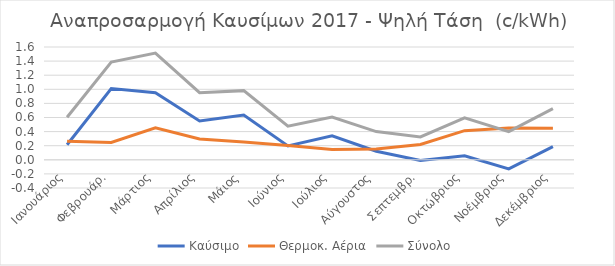
| Category | Καύσιμο | Θερμοκ. Αέρια | Σύνολο |
|---|---|---|---|
| Ιανουάριος | 0.214 | 0.262 | 0.604 |
| Φεβρουάρ. | 1.011 | 0.246 | 1.387 |
| Μάρτιος | 0.952 | 0.454 | 1.514 |
| Απρίλιος | 0.55 | 0.296 | 0.953 |
| Μάιος | 0.636 | 0.252 | 0.981 |
| Ιούνιος | 0.196 | 0.201 | 0.477 |
| Ιούλιος | 0.339 | 0.146 | 0.606 |
| Αύγουστος | 0.122 | 0.152 | 0.4 |
| Σεπτεμβρ. | -0.011 | 0.217 | 0.323 |
| Οκτώβριος | 0.056 | 0.414 | 0.594 |
| Νοέμβριος | -0.129 | 0.452 | 0.4 |
| Δεκέμβριος | 0.188 | 0.449 | 0.725 |